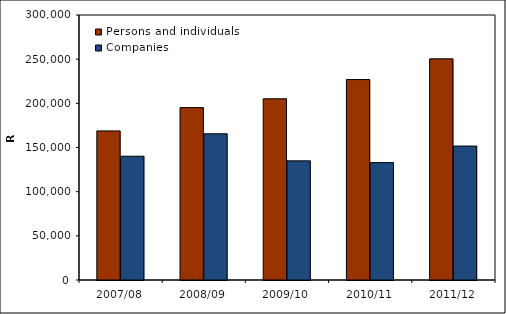
| Category | Persons and individuals | Companies |
|---|---|---|
| 2007/08 | 168774.351 | 140119.83 |
| 2008/09 | 195145.712 | 165538.96 |
| 2009/10 | 205145.021 | 134883.42 |
| 2010/11 | 226925.027 | 132901.679 |
| 2011/12 | 250399.64 | 151626.675 |